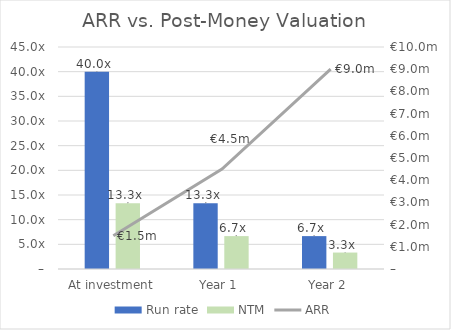
| Category | Run rate | NTM |
|---|---|---|
| At investment | 40 | 13.333 |
| Year 1 | 13.333 | 6.667 |
| Year 2 | 6.667 | 3.333 |